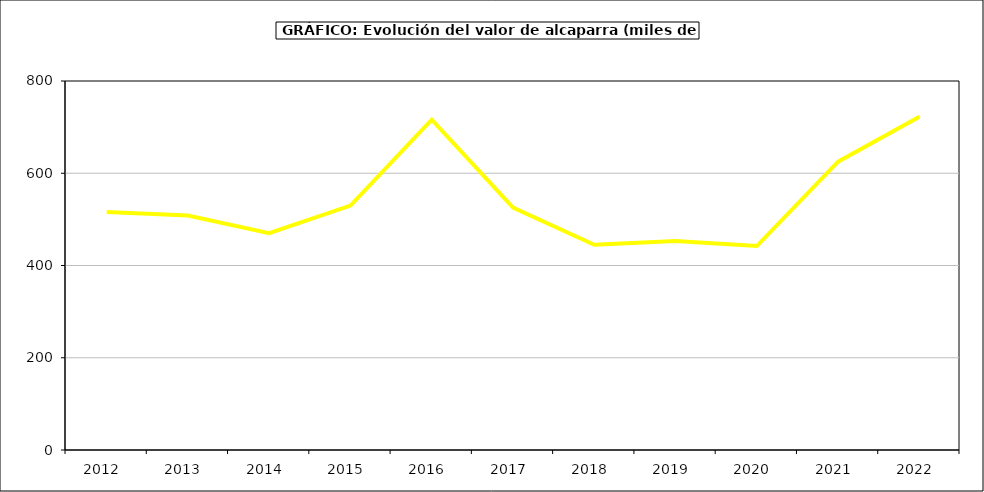
| Category | producción |
|---|---|
| 2012.0 | 516 |
| 2013.0 | 508.5 |
| 2014.0 | 470 |
| 2015.0 | 530 |
| 2016.0 | 716 |
| 2017.0 | 525.442 |
| 2018.0 | 444.946 |
| 2019.0 | 453.123 |
| 2020.0 | 442.138 |
| 2021.0 | 625.18 |
| 2022.0 | 722.262 |